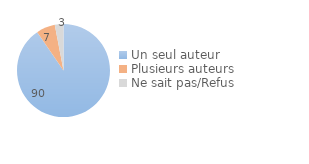
| Category | Series 0 |
|---|---|
| Un seul auteur | 90.446 |
| Plusieurs auteurs | 6.542 |
| Ne sait pas/Refus | 3.012 |